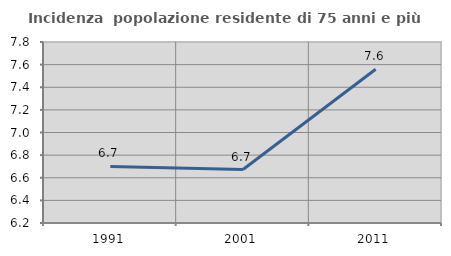
| Category | Incidenza  popolazione residente di 75 anni e più |
|---|---|
| 1991.0 | 6.7 |
| 2001.0 | 6.672 |
| 2011.0 | 7.56 |